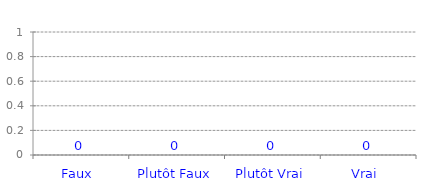
| Category | Nb de Mesures _x000d_(mes x) |
|---|---|
| Faux  | 0 |
| Plutôt Faux | 0 |
| Plutôt Vrai | 0 |
| Vrai  | 0 |